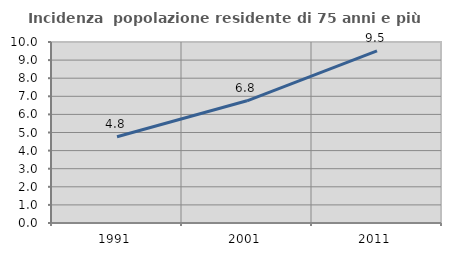
| Category | Incidenza  popolazione residente di 75 anni e più |
|---|---|
| 1991.0 | 4.762 |
| 2001.0 | 6.752 |
| 2011.0 | 9.514 |